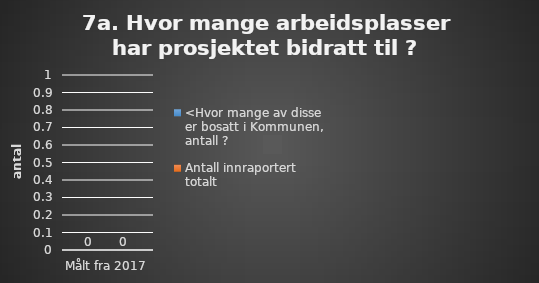
| Category | <Hvor mange av disse er bosatt i Kommunen, antall ? | Antall innraportert totalt |
|---|---|---|
| Målt fra 2017 | 0 | 0 |